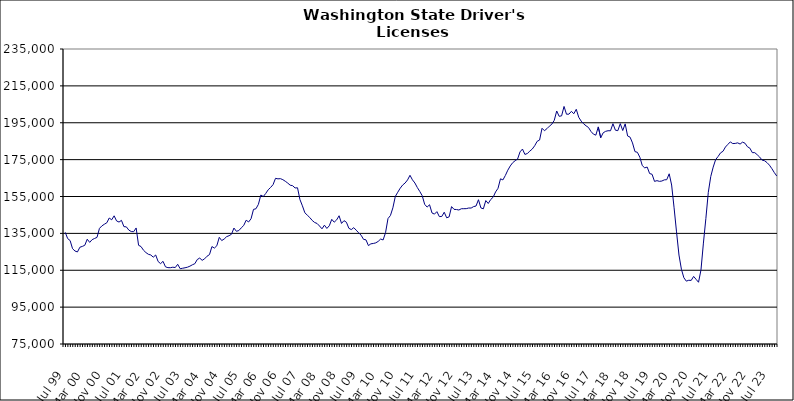
| Category | Series 0 |
|---|---|
| Jul 99 | 135560 |
| Aug 99 | 132182 |
| Sep 99 | 131104 |
| Oct 99 | 126694 |
| Nov 99 | 125425 |
| Dec 99 | 124927 |
| Jan 00 | 127499 |
| Feb 00 | 127927 |
| Mar 00 | 128547 |
| Apr 00 | 131834 |
| May 00 | 130120 |
| Jun 00 | 131595 |
| Jul 00 | 132236 |
| Aug 00 | 132819 |
| Sep 00 | 137711 |
| Oct 00 | 139063 |
| Nov 00 | 139952 |
| Dec 00 | 140732 |
| Jan 01 | 143338 |
| Feb 01 | 142359 |
| Mar 01 | 144523 |
| Apr 01 | 141758 |
| May 01 | 141135 |
| Jun 01 | 142064 |
| Jul 01 | 138646 |
| Aug 01 | 138530 |
| Sep 01 | 136784 |
| Oct 01 | 135996 |
| Nov 01 | 135917 |
| Dec 01 | 137940 |
| Jan 02 | 128531 |
| Feb 02 | 127848 |
| Mar 02 | 125876 |
| Apr 02 | 124595 |
| May 02 | 123660 |
| Jun 02 | 123282 |
| Jul 02 | 122089 |
| Aug 02 | 123279 |
| Sep 02 | 119727 |
| Oct 02 | 118588 |
| Nov 02 | 119854 |
| Dec 02 | 116851 |
| Jan 03 | 116407 |
| Feb 03 | 116382 |
| Mar 03 | 116648 |
| Apr 03 | 116471 |
| May 03 | 118231 |
| Jun 03 | 115831 |
| Jul 03 | 116082 |
| Aug 03 | 116341 |
| Sep 03 | 116653 |
| Oct 03 | 117212 |
| Nov 03 | 117962 |
| Dec 03 | 118542 |
| Jan 04 | 120817 |
| Feb 04 | 121617 |
| Mar 04 | 120369 |
| Apr 04 | 121200 |
| May 04 | 122609 |
| Jun 04 | 123484 |
| Jul 04 | 127844 |
| Aug 04 | 127025 |
| Sep 04 | 128273 |
| Oct 04 | 132853 |
| Nov 04 | 131106 |
| Dec 04 | 131935 |
| Jan 05 | 133205 |
| Feb 05 | 133736 |
| Mar 05 | 134528 |
| Apr 05 | 137889 |
| May 05 | 136130 |
| Jun 05 | 136523 |
| Jul 05 | 137997 |
| Aug 05 | 139294 |
| Sep 05 | 142140 |
| Oct 05 | 141192 |
| Nov 05 | 142937 |
| Dec 05 | 148013 |
| Jan 06 | 148341 |
| Feb 06 | 150744 |
| Mar 06 | 155794 |
| Apr 06 | 154984 |
| May 06 | 156651 |
| Jun 06 | 158638 |
| Jul 06 | 159911 |
| Aug 06 | 161445 |
| Sep 06 | 164852 |
| Oct 06 | 164570 |
| Nov 06 | 164679 |
| Dec 06 | 164127 |
| Jan 07 | 163271 |
| Feb 07 | 162273 |
| Mar 07 | 161140 |
| Apr 07 | 160860 |
| May 07 | 159633 |
| Jun 07 | 159724 |
| Jul 07 | 153303 |
| Aug 07 | 149939 |
| Sep 07 | 146172 |
| Oct 07 | 144876 |
| Nov 07 | 143613 |
| Dec 07 | 142022 |
| Jan 08 | 140909 |
| Feb 08 | 140368 |
| Mar 08 | 138998 |
| Apr 08 | 137471 |
| May 08 | 139453 |
| Jun 08 | 137680 |
| Jul 08 | 139120 |
| Aug 08 | 142612 |
| Sep-08 | 141071 |
| Oct 08 | 142313 |
| Nov 08 | 144556 |
| Dec 08 | 140394 |
| Jan 09 | 141903 |
| Feb 09 | 141036 |
| Mar 09 | 137751 |
| Apr 09 | 137060 |
| May 09 | 138101 |
| Jun 09 | 136739 |
| Jul 09 | 135317 |
| Aug 09 | 134020 |
| Sep 09 | 131756 |
| Oct 09 | 131488 |
| Nov 09 | 128370 |
| Dec 09 | 129323 |
| Jan 10 | 129531 |
| Feb 10 | 129848 |
| Mar 10 | 130654 |
| Apr 10 | 131929 |
| May 10 | 131429 |
| Jun 10 | 135357 |
| Jul 10 | 143032 |
| Aug 10 | 144686 |
| Sep 10 | 148856 |
| Oct 10 | 155042 |
| Nov 10 | 157328 |
| Dec 10 | 159501 |
| Jan 11 | 161221 |
| Feb 11 | 162312 |
| Mar 11 | 163996 |
| Apr 11 | 166495 |
| May 11 | 164040 |
| Jun 11 | 162324 |
| Jul 11 | 159862 |
| Aug 11 | 157738 |
| Sep 11 | 155430 |
| Oct 11 | 150762 |
| Nov 11 | 149255 |
| Dec 11 | 150533 |
| Jan 12 | 146068 |
| Feb 12 | 145446 |
| Mar 12 | 146788 |
| Apr 12 | 144110 |
| May 12 | 144162 |
| Jun 12 | 146482 |
| Jul 12 | 143445 |
| Aug 12 | 143950 |
| Sep 12 | 149520 |
| Oct 12 | 148033 |
| Nov 12 | 147926 |
| Dec 12 | 147674 |
| Jan 13 | 148360 |
| Feb-13 | 148388 |
| Mar-13 | 148414 |
| Apr 13 | 148749 |
| May 13 | 148735 |
| Jun-13 | 149521 |
| Jul 13 | 149837 |
| Aug 13 | 153252 |
| Sep 13 | 148803 |
| Oct 13 | 148315 |
| Nov 13 | 152804 |
| Dec 13 | 151209 |
| Jan 14 | 153357 |
| Feb-14 | 154608 |
| Mar 14 | 157479 |
| Apr 14 | 159441 |
| May 14 | 164591 |
| Jun 14 | 163995 |
| Jul-14 | 166411 |
| Aug-14 | 169272 |
| Sep 14 | 171565 |
| Oct 14 | 173335 |
| Nov 14 | 174406 |
| Dec 14 | 175302 |
| Jan 15 | 179204 |
| Feb 15 | 180737 |
| Mar 15 | 177810 |
| Apr-15 | 178331 |
| May 15 | 179601 |
| Jun-15 | 180729 |
| Jul 15 | 182540 |
| Aug 15 | 184924 |
| Sep 15 | 185620 |
| Oct 15 | 192002 |
| Nov 15 | 190681 |
| Dec 15 | 191795 |
| Jan 16 | 193132 |
| Feb 16 | 194206 |
| Mar 16 | 196319 |
| Apr 16 | 201373 |
| May 16 | 198500 |
| Jun 16 | 198743 |
| Jul 16 | 203841 |
| Aug 16 | 199630 |
| Sep 16 | 199655 |
| Oct 16 | 201181 |
| Nov 16 | 199888 |
| Dec 16 | 202304 |
| Jan 17 | 197977 |
| Feb 17 | 195889 |
| Mar 17 | 194438 |
| Apr 17 | 193335 |
| May 17 | 192430 |
| Jun 17 | 190298 |
| Jul 17 | 188832 |
| Aug 17 | 188264 |
| Sep 17 | 192738 |
| Oct 17 | 186856 |
| Nov 17 | 189537 |
| Dec 17 | 190341 |
| Jan 18 | 190670 |
| Feb 18 | 190645 |
| Mar 18 | 194476 |
| Apr 18 | 190971 |
| May 18 | 190707 |
| Jun 18 | 194516 |
| Jul 18 | 190783 |
| Aug 18 | 194390 |
| Sep 18 | 187831 |
| Oct 18 | 187188 |
| Nov 18 | 184054 |
| Dec 18 | 179347 |
| Jan 19 | 178958 |
| Feb 19 | 176289 |
| Mar 19 | 171747 |
| Apr 19 | 170532 |
| May 19 | 170967 |
| Jun 19 | 167444 |
| Jul 19 | 167059 |
| Aug 19 | 163194 |
| Sep 19 | 163599 |
| Oct 19 | 163212 |
| Nov 19 | 163388 |
| Dec 19 | 164024 |
| Jan 20 | 164114 |
| Feb 20 | 167320 |
| Mar 20 | 161221 |
| Apr 20 | 148866 |
| May 20 | 135821 |
| Jun 20 | 123252 |
| Jul 20 | 115526 |
| Aug 20 | 110940 |
| Sep 20 | 109099 |
| Oct 20 | 109566 |
| Nov 20 | 109488 |
| Dec 20 | 111658 |
| Jan 21 | 110070 |
| Feb 21 | 108491 |
| Mar 21 | 115176 |
| Apr 21 | 129726 |
| May 21 | 143052 |
| Jun 21 | 157253 |
| Jul 21 | 165832 |
| Aug 21 | 170937 |
| Sep 21 | 175042 |
| Oct 21 | 176696 |
| Nov 21 | 178677 |
| Dec 21 | 179501 |
| Jan 22 | 181825 |
| Feb 22 | 183258 |
| Mar 22 | 184618 |
| Apr 22 | 183710 |
| May 22 | 183784 |
| Jun 22 | 184101 |
| Jul 22 | 183443 |
| Aug 22 | 184475 |
| Sep 22 | 183902 |
| Oct 22 | 181994 |
| Nov 22 | 181207 |
| Dec 22 | 178793 |
| Jan 23 | 178782 |
| Feb 23 | 177647 |
| Mar 23 | 176386 |
| Apr 23 | 174729 |
| May 23 | 174390 |
| Jun 23 | 173391 |
| Jul 23 | 171988 |
| Aug 23 | 170100 |
| Sep 23 | 167953 |
| Oct 23 | 166088 |